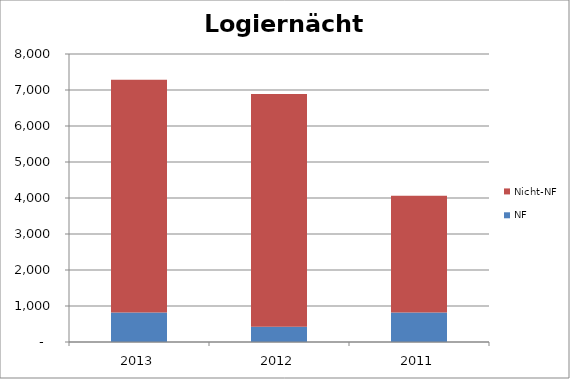
| Category | NF | Nicht-NF |
|---|---|---|
| 2013.0 | 817 | 6471 |
| 2012.0 | 420.5 | 6471 |
| 2011.0 | 817 | 3247.5 |